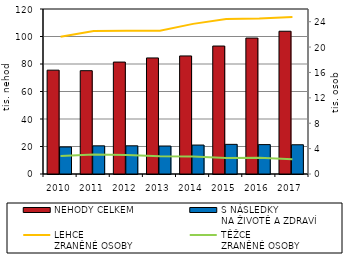
| Category | NEHODY CELKEM | S NÁSLEDKY 
NA ŽIVOTĚ A ZDRAVÍ |
|---|---|---|
| 2010.0 | 75522 | 19676 |
| 2011.0 | 75137 | 20487 |
| 2012.0 | 81404 | 20504 |
| 2013.0 | 84398 | 20342 |
| 2014.0 | 85859 | 21054 |
| 2015.0 | 93067 | 21561 |
| 2016.0 | 98864 | 21386 |
| 2017.0 | 103821 | 21263 |